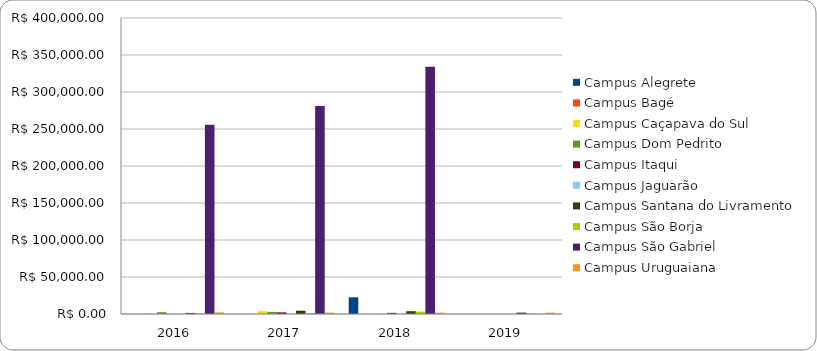
| Category | Campus Alegrete | Campus Bagé | Campus Caçapava do Sul | Campus Dom Pedrito | Campus Itaqui | Campus Jaguarão | Campus Santana do Livramento | Campus São Borja | Campus São Gabriel | Campus Uruguaiana |
|---|---|---|---|---|---|---|---|---|---|---|
| 2016.0 | 0 | 0 | 1081.5 | 2491 | 0 | 0 | 1416 | 1062 | 255772.5 | 2150 |
| 2017.0 | 0 | 0 | 3894 | 2845 | 2232 | 0 | 4451 | 1327.5 | 281134.78 | 1900 |
| 2018.0 | 22546.04 | 0 | 0 | 0 | 1504.5 | 0 | 3783.1 | 3186 | 334022.8 | 1800 |
| 2019.0 | 0 | 0 | 0 | 0 | 0 | 0 | 1871.5 | 1062 | 0 | 1789.5 |